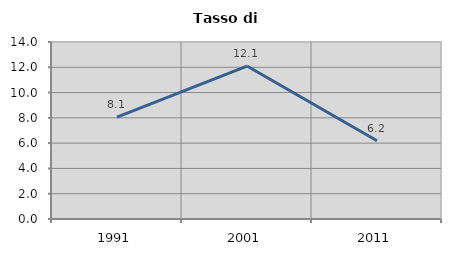
| Category | Tasso di disoccupazione   |
|---|---|
| 1991.0 | 8.054 |
| 2001.0 | 12.097 |
| 2011.0 | 6.195 |